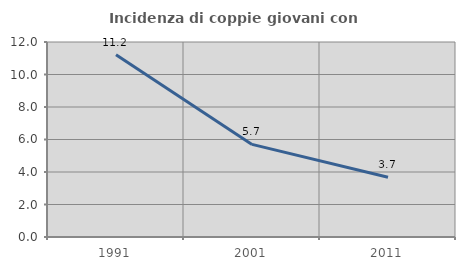
| Category | Incidenza di coppie giovani con figli |
|---|---|
| 1991.0 | 11.212 |
| 2001.0 | 5.698 |
| 2011.0 | 3.674 |